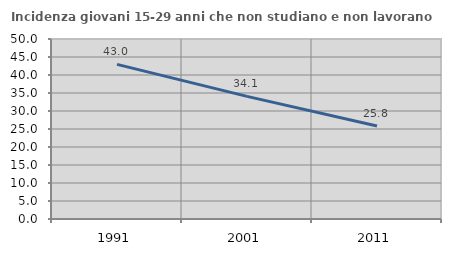
| Category | Incidenza giovani 15-29 anni che non studiano e non lavorano  |
|---|---|
| 1991.0 | 42.961 |
| 2001.0 | 34.062 |
| 2011.0 | 25.833 |